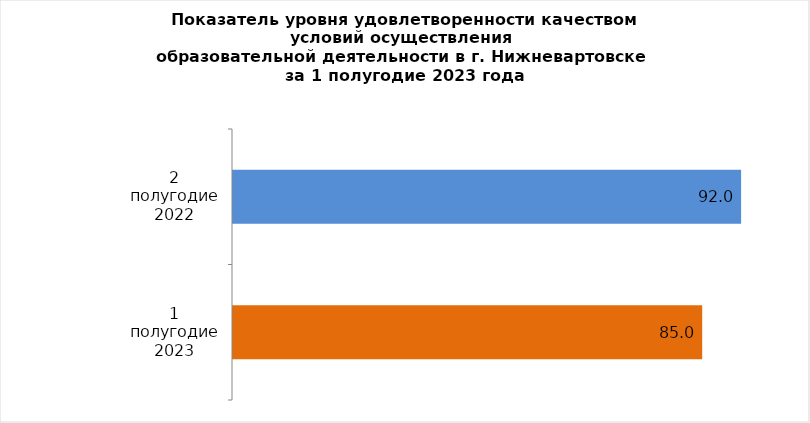
| Category | 1 полугодие 2022 2 полугодие 2022 |
|---|---|
| 2 полугодие 2022 | 92.048 |
| 1 полугодие 2023 | 84.998 |